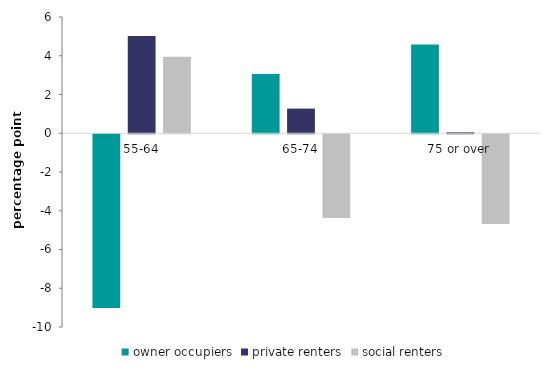
| Category | owner occupiers | private renters | social renters |
|---|---|---|---|
| 55-64 | -8.974 | 5.025 | 3.949 |
| 65-74 | 3.055 | 1.273 | -4.327 |
| 75 or over | 4.579 | 0.051 | -4.63 |